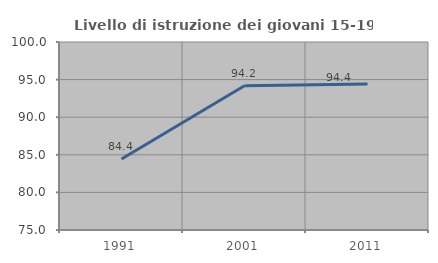
| Category | Livello di istruzione dei giovani 15-19 anni |
|---|---|
| 1991.0 | 84.435 |
| 2001.0 | 94.181 |
| 2011.0 | 94.402 |